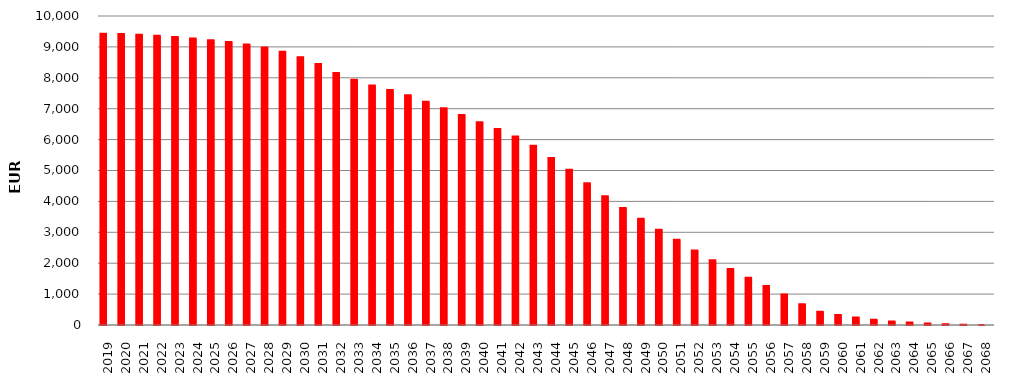
| Category | 9424061654 | SumOfMont Cred Ced act |
|---|---|---|
| 2019 | 9422705256.88 | 1356396.83 |
| 2020 | 9414891231.76 | 7814025.12 |
| 2021 | 9395085774 | 19805457.76 |
| 2022 | 9363922950.4 | 31162823.6 |
| 2023 | 9322196390.85 | 41726559.55 |
| 2024 | 9270830372.22 | 51366018.63 |
| 2025 | 9219165168.86 | 51665203.36 |
| 2026 | 9158662485.9 | 60502682.96 |
| 2027 | 9077185403.6 | 81477082.3 |
| 2028 | 8982402705.78 | 94782697.82 |
| 2029 | 8840395459.61 | 142007246.17 |
| 2030 | 8664375198.72 | 176020260.89 |
| 2031 | 8448624971.81 | 215750226.91 |
| 2032 | 8152176733.19 | 296448238.62 |
| 2033 | 7939302188.56 | 212874544.63 |
| 2034 | 7751060385.42 | 188241803.14 |
| 2035 | 7601498458.42 | 149561927 |
| 2036 | 7436436425.47 | 165062032.95 |
| 2037 | 7222239628.8 | 214196796.67 |
| 2038 | 7012529440.2 | 209710188.6 |
| 2039 | 6792459252.28 | 220070187.92 |
| 2040 | 6559254210.79 | 233205041.49 |
| 2041 | 6339343337.12 | 219910873.67 |
| 2042 | 6096376801.25 | 242966535.87 |
| 2043 | 5799272135.94 | 297104665.31 |
| 2044 | 5402360876.27 | 396911259.67 |
| 2045 | 5026677843.15 | 375683033.12 |
| 2046 | 4587955208.01 | 438722635.14 |
| 2047 | 4165234703.56 | 422720504.45 |
| 2048 | 3782674985.56 | 382559718 |
| 2049 | 3441859104.35 | 340815881.21 |
| 2050 | 3084764116.84 | 357094987.51 |
| 2051 | 2760789143.08 | 323974973.76 |
| 2052 | 2409245827.13 | 351543315.95 |
| 2053 | 2093481314.07 | 315764513.06 |
| 2054 | 1810836443.82 | 282644870.25 |
| 2055 | 1528909954.22 | 281926489.6 |
| 2056 | 1265724709.94 | 263185244.28 |
| 2057 | 989353222.48 | 276371487.46 |
| 2058 | 672268480.23 | 317084742.25 |
| 2059 | 428269247.25 | 243999232.98 |
| 2060 | 323178983.32 | 105090263.93 |
| 2061 | 240705557.62 | 82473425.7 |
| 2062 | 171165575.47 | 69539982.15 |
| 2063 | 111273876.58 | 59891698.89 |
| 2064 | 79394003.36 | 31879873.22 |
| 2065 | 49208097.82 | 30185905.54 |
| 2066 | 25715046.44 | 23493051.38 |
| 2067 | 9341712.8 | 16373333.64 |
| 2068 | 0 | 9341712.8 |